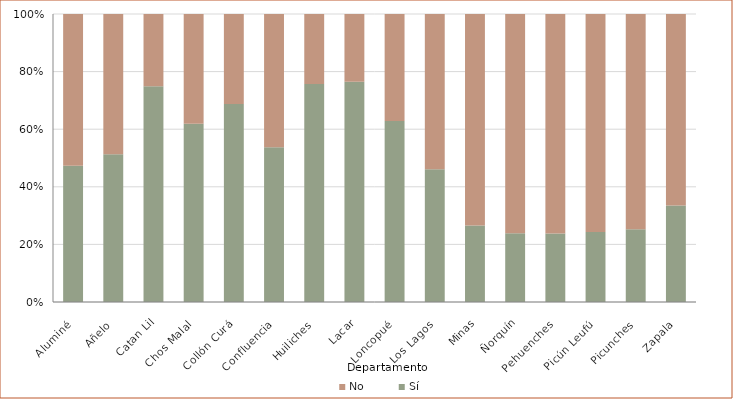
| Category | Sí | No |
|---|---|---|
|  Aluminé | 47.274 | 52.726 |
|  Añelo | 51.303 | 48.697 |
|  Catan Lil | 74.939 | 25.061 |
|  Chos Malal | 61.862 | 38.138 |
|  Collón Curá | 68.711 | 31.289 |
|  Confluencia | 53.748 | 46.252 |
|  Huiliches | 75.667 | 24.333 |
|  Lacar | 76.514 | 23.486 |
|  Loncopué | 62.882 | 37.118 |
|  Los Lagos | 46.079 | 53.921 |
|  Minas | 26.599 | 73.401 |
|  Ñorquín | 23.845 | 76.155 |
|  Pehuenches | 23.819 | 76.181 |
|  Picún Leufú | 24.344 | 75.656 |
|  Picunches | 25.248 | 74.752 |
|  Zapala | 33.488 | 66.512 |